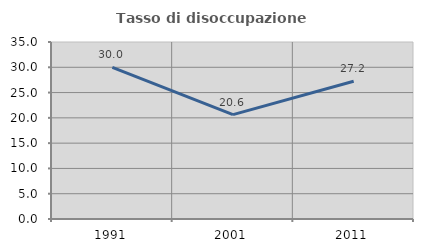
| Category | Tasso di disoccupazione giovanile  |
|---|---|
| 1991.0 | 29.996 |
| 2001.0 | 20.646 |
| 2011.0 | 27.235 |